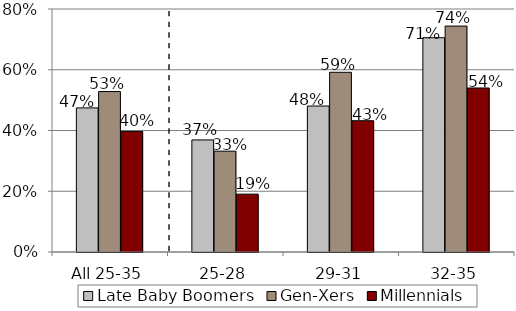
| Category | Late Baby Boomers | Gen-Xers | Millennials |
|---|---|---|---|
| All 25-35 | 0.474 | 0.528 | 0.397 |
| 25-28 | 0.369 | 0.332 | 0.191 |
| 29-31 | 0.481 | 0.592 | 0.432 |
| 32-35 | 0.706 | 0.744 | 0.54 |